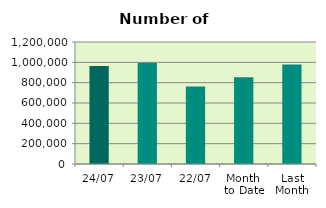
| Category | Series 0 |
|---|---|
| 24/07 | 964096 |
| 23/07 | 995150 |
| 22/07 | 762726 |
| Month 
to Date | 854504 |
| Last
Month | 977938.2 |